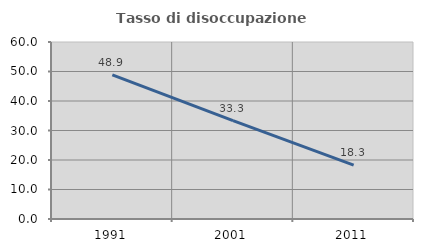
| Category | Tasso di disoccupazione giovanile  |
|---|---|
| 1991.0 | 48.889 |
| 2001.0 | 33.333 |
| 2011.0 | 18.269 |